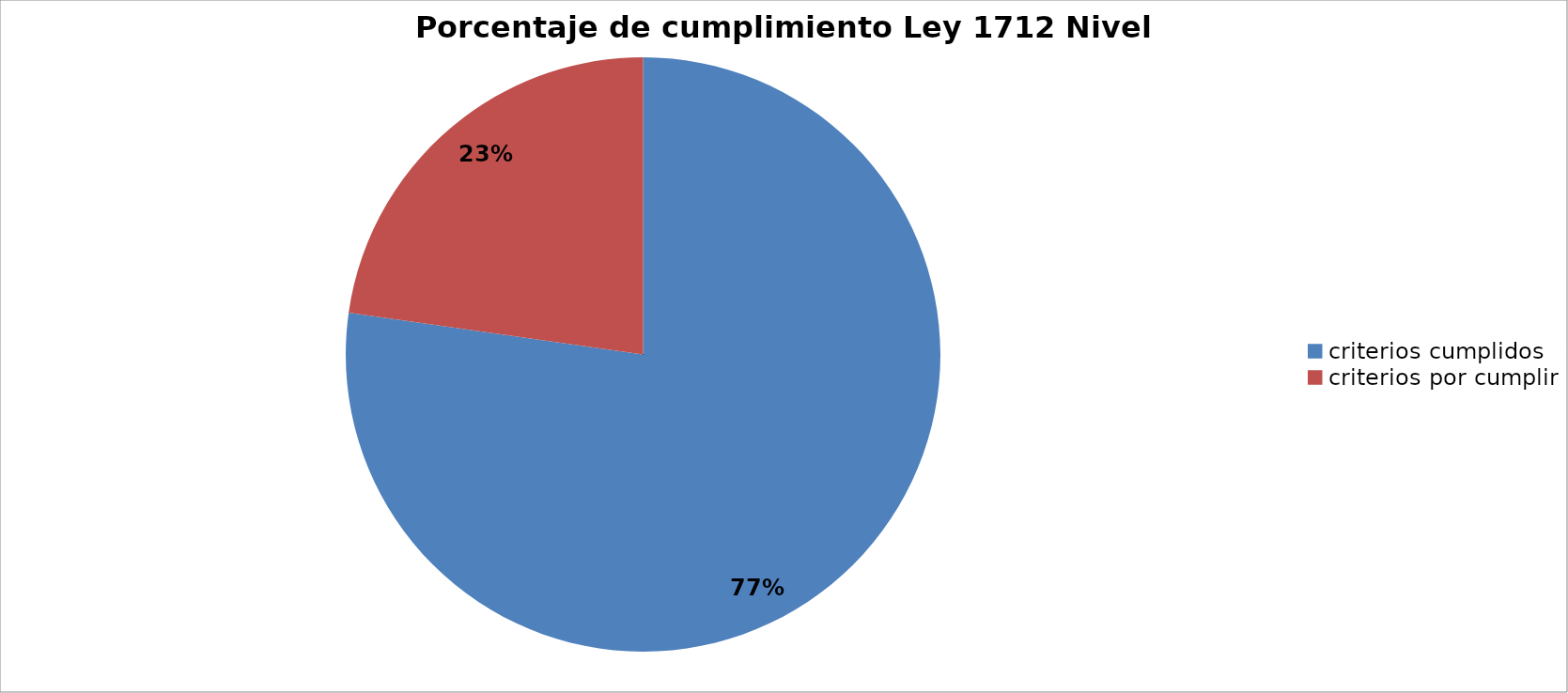
| Category | Series 0 |
|---|---|
| criterios cumplidos | 129 |
| criterios por cumplir | 38 |